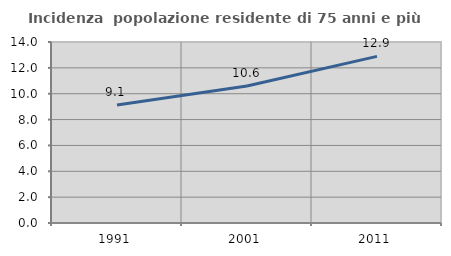
| Category | Incidenza  popolazione residente di 75 anni e più |
|---|---|
| 1991.0 | 9.119 |
| 2001.0 | 10.59 |
| 2011.0 | 12.888 |